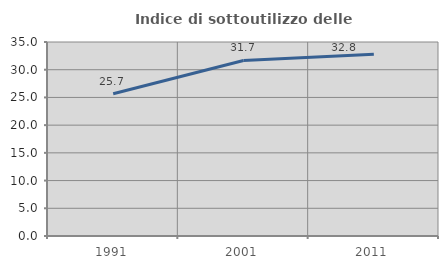
| Category | Indice di sottoutilizzo delle abitazioni  |
|---|---|
| 1991.0 | 25.656 |
| 2001.0 | 31.662 |
| 2011.0 | 32.812 |